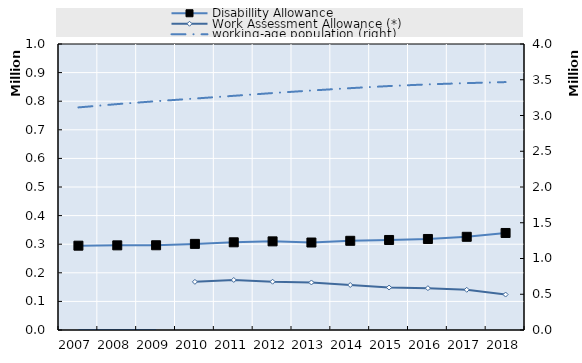
| Category | Disabillity Allowance | Work Assessment Allowance (*) |
|---|---|---|
| 2007.0 | 294850 | 0 |
| 2008.0 | 295968 | 0 |
| 2009.0 | 296300 | 0 |
| 2010.0 | 301088 | 168348.167 |
| 2011.0 | 306653 | 175030 |
| 2012.0 | 309887 | 168818.75 |
| 2013.0 | 305889 | 166159 |
| 2014.0 | 311880 | 157333 |
| 2015.0 | 314755 | 148535 |
| 2016.0 | 318244 | 146262 |
| 2017.0 | 325875 | 140623 |
| 2018.0 | 339245 | 123968 |